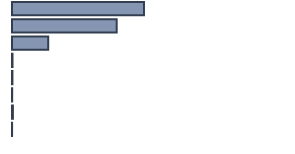
| Category | Series 0 |
|---|---|
| 0 | 48.167 |
| 1 | 38.204 |
| 2 | 13.215 |
| 3 | 0.184 |
| 4 | 0.154 |
| 5 | 0.062 |
| 6 | 0.325 |
| 7 | 0.028 |